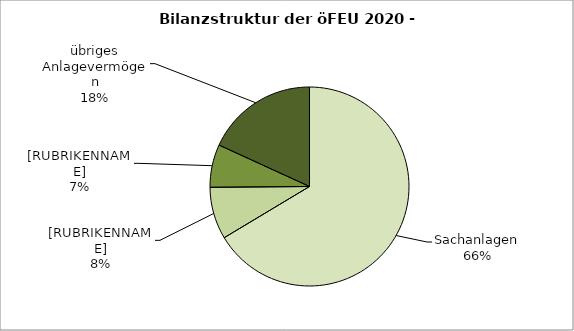
| Category | Series 0 |
|---|---|
| Sachanlagen | 66.393 |
| übriges Umlaufvermögen übrige Aktiva | 8.475 |
| Forderungen | 6.968 |
| übriges Anlagevermögen | 18.164 |